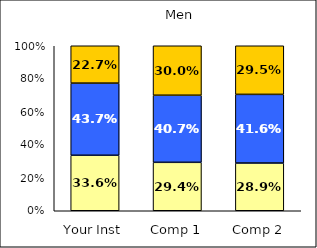
| Category | Low Pluralistic Orientation | Average Pluralistic Orientation | High Pluralistic Orientation |
|---|---|---|---|
| Your Inst | 0.336 | 0.437 | 0.227 |
| Comp 1 | 0.294 | 0.407 | 0.3 |
| Comp 2 | 0.289 | 0.416 | 0.295 |